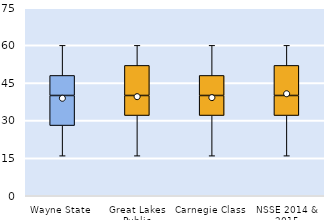
| Category | 25th | 50th | 75th |
|---|---|---|---|
| Wayne State | 28 | 12 | 8 |
| Great Lakes Public | 32 | 8 | 12 |
| Carnegie Class | 32 | 8 | 8 |
| NSSE 2014 & 2015 | 32 | 8 | 12 |